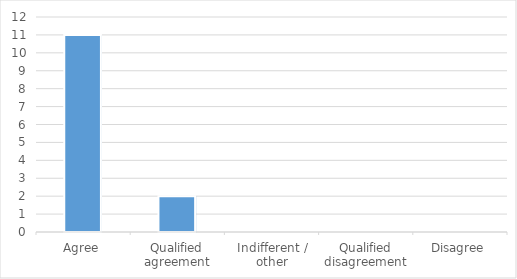
| Category | Series 0 |
|---|---|
| Agree | 11 |
| Qualified agreement | 2 |
| Indifferent / other | 0 |
| Qualified disagreement | 0 |
| Disagree | 0 |